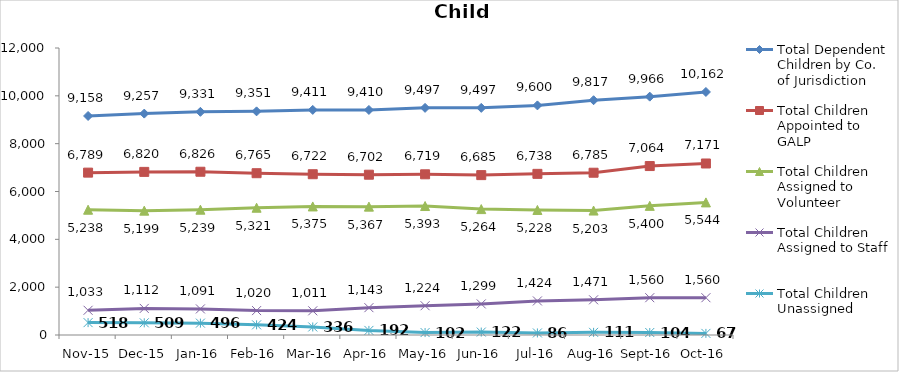
| Category | Total Dependent Children by Co. of Jurisdiction | Total Children Appointed to GALP | Total Children Assigned to Volunteer | Total Children Assigned to Staff | Total Children Unassigned |
|---|---|---|---|---|---|
| Nov-15 | 9158 | 6789 | 5238 | 1033 | 518 |
| Dec-15 | 9257 | 6820 | 5199 | 1112 | 509 |
| Jan-16 | 9331 | 6826 | 5239 | 1091 | 496 |
| Feb-16 | 9351 | 6765 | 5321 | 1020 | 424 |
| Mar-16 | 9411 | 6722 | 5375 | 1011 | 336 |
| Apr-16 | 9410 | 6702 | 5367 | 1143 | 192 |
| May-16 | 9497 | 6719 | 5393 | 1224 | 102 |
| Jun-16 | 9497 | 6685 | 5264 | 1299 | 122 |
| Jul-16 | 9600 | 6738 | 5228 | 1424 | 86 |
| Aug-16 | 9817 | 6785 | 5203 | 1471 | 111 |
| Sep-16 | 9966 | 7064 | 5400 | 1560 | 104 |
| Oct-16 | 10162 | 7171 | 5544 | 1560 | 67 |